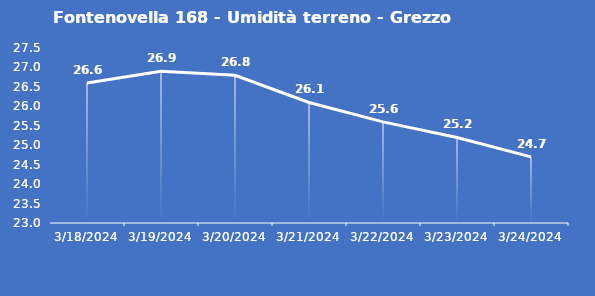
| Category | Fontenovella 168 - Umidità terreno - Grezzo (%VWC) |
|---|---|
| 3/18/24 | 26.6 |
| 3/19/24 | 26.9 |
| 3/20/24 | 26.8 |
| 3/21/24 | 26.1 |
| 3/22/24 | 25.6 |
| 3/23/24 | 25.2 |
| 3/24/24 | 24.7 |